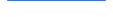
| Category | Series 0 |
|---|---|
| 0 | 3 |
| 1 | 6 |
| 2 | 7 |
| 3 | 7 |
| 4 | 4 |
| 5 | 2 |
| 6 | 13 |
| 7 | 12 |
| 8 | 20 |